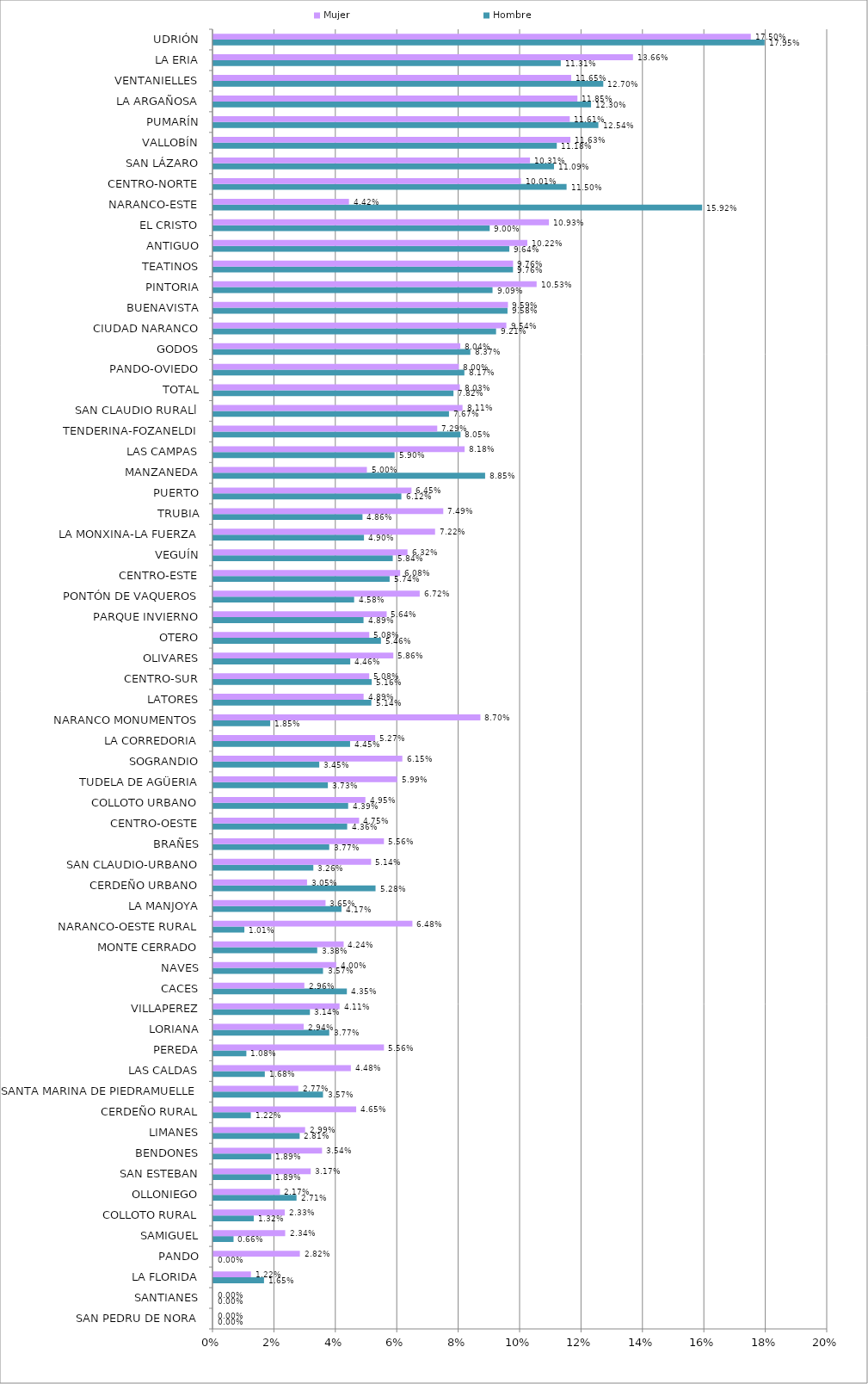
| Category | Hombre | Mujer |
|---|---|---|
| SAN PEDRU DE NORA | 0 | 0 |
| SANTIANES | 0 | 0 |
| LA FLORIDA | 0.016 | 0.012 |
| PANDO | 0 | 0.028 |
| SAMIGUEL | 0.007 | 0.023 |
| COLLOTO RURAL | 0.013 | 0.023 |
| OLLONIEGO | 0.027 | 0.022 |
| SAN ESTEBAN | 0.019 | 0.032 |
| BENDONES | 0.019 | 0.035 |
| LIMANES | 0.028 | 0.03 |
| CERDEÑO RURAL | 0.012 | 0.047 |
| SANTA MARINA DE PIEDRAMUELLE | 0.036 | 0.028 |
| LAS CALDAS | 0.017 | 0.045 |
| PEREDA | 0.011 | 0.056 |
| LORIANA | 0.038 | 0.029 |
| VILLAPEREZ | 0.031 | 0.041 |
| CACES | 0.043 | 0.03 |
| NAVES | 0.036 | 0.04 |
| MONTE CERRADO | 0.034 | 0.042 |
| NARANCO-OESTE RURAL | 0.01 | 0.065 |
| LA MANJOYA | 0.042 | 0.037 |
| CERDEÑO URBANO | 0.053 | 0.031 |
| SAN CLAUDIO-URBANO | 0.033 | 0.051 |
| BRAÑES | 0.038 | 0.056 |
| CENTRO-OESTE | 0.044 | 0.047 |
| COLLOTO URBANO | 0.044 | 0.05 |
| TUDELA DE AGÜERIA | 0.037 | 0.06 |
| SOGRANDIO | 0.034 | 0.062 |
| LA CORREDORIA | 0.045 | 0.053 |
| NARANCO MONUMENTOS | 0.019 | 0.087 |
| LATORES | 0.051 | 0.049 |
| CENTRO-SUR | 0.052 | 0.051 |
| OLIVARES | 0.045 | 0.059 |
| OTERO | 0.055 | 0.051 |
| PARQUE INVIERNO | 0.049 | 0.056 |
| PONTÓN DE VAQUEROS | 0.046 | 0.067 |
| CENTRO-ESTE | 0.057 | 0.061 |
| VEGUÍN | 0.058 | 0.063 |
| LA MONXINA-LA FUERZA | 0.049 | 0.072 |
| TRUBIA | 0.049 | 0.075 |
| PUERTO | 0.061 | 0.065 |
| MANZANEDA | 0.088 | 0.05 |
| LAS CAMPAS | 0.059 | 0.082 |
| TENDERINA-FOZANELDI | 0.08 | 0.073 |
| SAN CLAUDIO RURALl | 0.077 | 0.081 |
| TOTAL | 0.078 | 0.08 |
| PANDO-OVIEDO | 0.082 | 0.08 |
| GODOS | 0.084 | 0.08 |
| CIUDAD NARANCO | 0.092 | 0.095 |
| BUENAVISTA | 0.096 | 0.096 |
| PINTORIA | 0.091 | 0.105 |
| TEATINOS | 0.098 | 0.098 |
| ANTIGUO | 0.096 | 0.102 |
| EL CRISTO | 0.09 | 0.109 |
| NARANCO-ESTE | 0.159 | 0.044 |
| CENTRO-NORTE | 0.115 | 0.1 |
| SAN LÁZARO | 0.111 | 0.103 |
| VALLOBÍN | 0.112 | 0.116 |
| PUMARÍN | 0.125 | 0.116 |
| LA ARGAÑOSA | 0.123 | 0.119 |
| VENTANIELLES | 0.127 | 0.117 |
| LA ERIA | 0.113 | 0.137 |
| UDRIÓN | 0.179 | 0.175 |